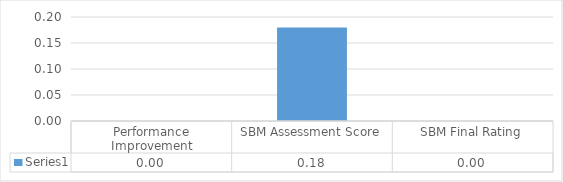
| Category | Series 0 |
|---|---|
| Performance Improvement | 0 |
| SBM Assessment Score | 0.18 |
| SBM Final Rating | 0 |